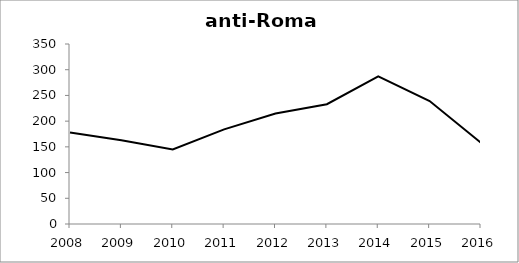
| Category | Series 0 |
|---|---|
| 2008.0 | 178 |
| 2009.0 | 163 |
| 2010.0 | 145 |
| 2011.0 | 184 |
| 2012.0 | 214.849 |
| 2013.0 | 233 |
| 2014.0 | 287 |
| 2015.0 | 239 |
| 2016.0 | 158 |